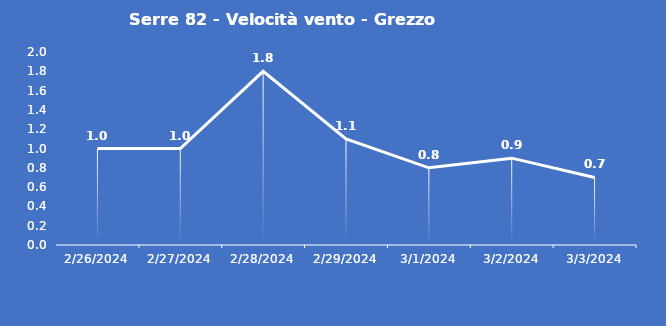
| Category | Serre 82 - Velocità vento - Grezzo (m/s) |
|---|---|
| 2/26/24 | 1 |
| 2/27/24 | 1 |
| 2/28/24 | 1.8 |
| 2/29/24 | 1.1 |
| 3/1/24 | 0.8 |
| 3/2/24 | 0.9 |
| 3/3/24 | 0.7 |